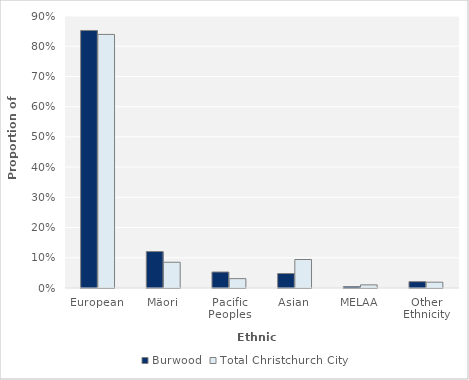
| Category | Burwood | Total Christchurch City |
|---|---|---|
| European | 0.852 | 0.839 |
| Mäori | 0.121 | 0.085 |
| Pacific Peoples | 0.053 | 0.031 |
| Asian | 0.048 | 0.094 |
| MELAA | 0.005 | 0.01 |
| Other Ethnicity | 0.021 | 0.019 |